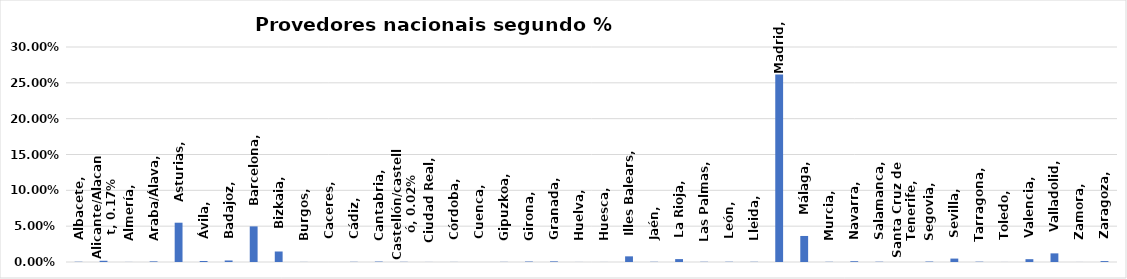
| Category | Series 0 |
|---|---|
| Albacete | 0 |
| Alicante/Alacant | 0.002 |
| Almería | 0 |
| Araba/Álava | 0.001 |
| Asturias | 0.055 |
| Ávila | 0.001 |
| Badajoz | 0.002 |
| Barcelona | 0.05 |
| Bizkaia | 0.015 |
| Burgos | 0 |
| Caceres | 0 |
| Cádiz | 0 |
| Cantabria | 0.001 |
| Castellón/castelló | 0 |
| Ciudad Real | 0 |
| Córdoba | 0 |
| Cuenca | 0 |
| Gipuzkoa | 0 |
| Girona | 0.001 |
| Granada | 0.001 |
| Huelva | 0 |
| Huesca | 0 |
| Illes Balears | 0.008 |
| Jaén | 0 |
| La Rioja | 0.004 |
| Las Palmas | 0 |
| León | 0 |
| Lleida | 0 |
| Madrid | 0.262 |
| Málaga | 0.036 |
| Murcia | 0 |
| Navarra | 0.001 |
| Salamanca | 0 |
| Santa Cruz de Tenerife | 0 |
| Segovia | 0.001 |
| Sevilla | 0.005 |
| Tarragona | 0 |
| Toledo | 0 |
| Valencia | 0.004 |
| Valladolid | 0.012 |
| Zamora | 0 |
| Zaragoza | 0.001 |